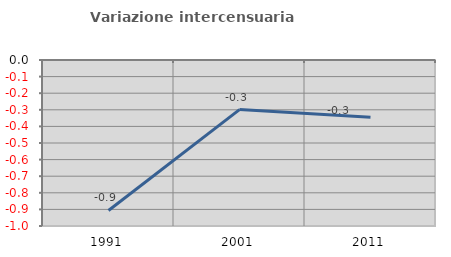
| Category | Variazione intercensuaria annua |
|---|---|
| 1991.0 | -0.906 |
| 2001.0 | -0.299 |
| 2011.0 | -0.345 |